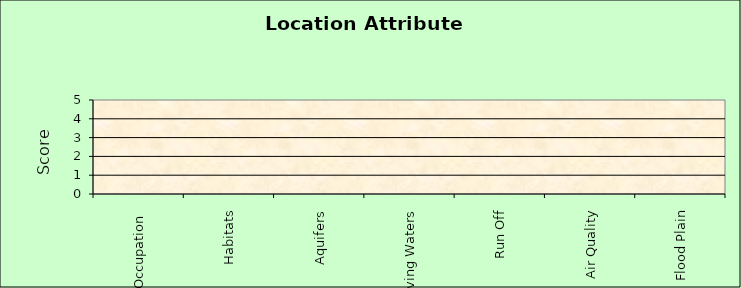
| Category | Series 0 |
|---|---|
| Occupation  | 0 |
| Habitats | 0 |
| Aquifers | 0 |
| Receiving Waters | 0 |
| Run Off | 0 |
| Air Quality | 0 |
| Flood Plain | 0 |